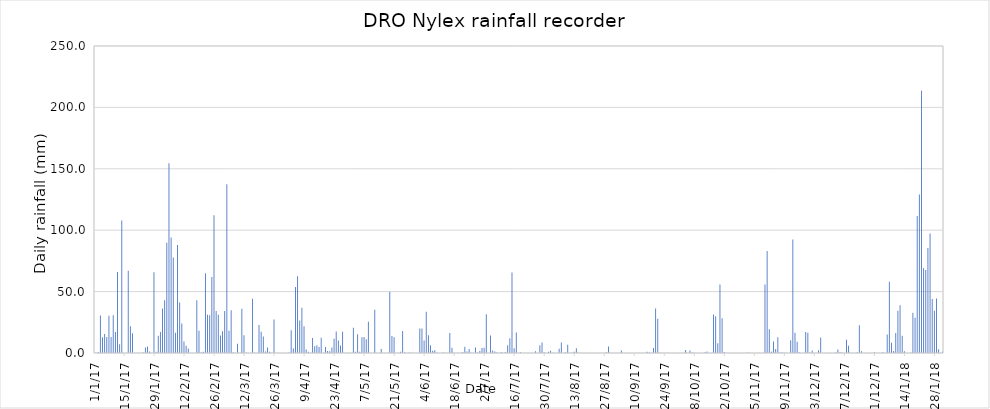
| Category | Series 0 |
|---|---|
| 2017-01-01 | 0 |
| 2017-01-02 | 0.8 |
| 2017-01-03 | 30.6 |
| 2017-01-04 | 12.8 |
| 2017-01-05 | 15.4 |
| 2017-01-06 | 13 |
| 2017-01-07 | 30.4 |
| 2017-01-08 | 13 |
| 2017-01-09 | 30.8 |
| 2017-01-10 | 17.1 |
| 2017-01-11 | 66 |
| 2017-01-12 | 7.1 |
| 2017-01-13 | 108 |
| 2017-01-14 | 0 |
| 2017-01-15 | 0 |
| 2017-01-16 | 67 |
| 2017-01-17 | 21.7 |
| 2017-01-18 | 16.1 |
| 2017-01-19 | 0 |
| 2017-01-20 | 0 |
| 2017-01-21 | 0 |
| 2017-01-22 | 0 |
| 2017-01-23 | 0.4 |
| 2017-01-24 | 4.5 |
| 2017-01-25 | 5.3 |
| 2017-01-26 | 1.2 |
| 2017-01-27 | 0.1 |
| 2017-01-28 | 65.7 |
| 2017-01-29 | 1.02 |
| 2017-01-30 | 14.1 |
| 2017-01-31 | 17 |
| 2017-02-01 | 36.3 |
| 2017-02-02 | 43 |
| 2017-02-03 | 89.7 |
| 2017-02-04 | 154.5 |
| 2017-02-05 | 94 |
| 2017-02-06 | 77.7 |
| 2017-02-07 | 16.5 |
| 2017-02-08 | 88 |
| 2017-02-09 | 41.2 |
| 2017-02-10 | 24 |
| 2017-02-11 | 9.3 |
| 2017-02-12 | 6 |
| 2017-02-13 | 3.7 |
| 2017-02-14 | 0 |
| 2017-02-15 | 0 |
| 2017-02-16 | 0 |
| 2017-02-17 | 43 |
| 2017-02-18 | 18.1 |
| 2017-02-19 | 0.5 |
| 2017-02-20 | 1.1 |
| 2017-02-21 | 65 |
| 2017-02-22 | 31.1 |
| 2017-02-23 | 30.7 |
| 2017-02-24 | 61.8 |
| 2017-02-25 | 112.1 |
| 2017-02-26 | 34.2 |
| 2017-02-27 | 31.2 |
| 2017-02-28 | 14.2 |
| 2017-03-01 | 17.8 |
| 2017-03-02 | 34.2 |
| 2017-03-03 | 137.5 |
| 2017-03-04 | 18.2 |
| 2017-03-05 | 34.8 |
| 2017-03-06 | 0.5 |
| 2017-03-07 | 0 |
| 2017-03-08 | 7.6 |
| 2017-03-09 | 0.1 |
| 2017-03-10 | 36 |
| 2017-03-11 | 14.5 |
| 2017-03-12 | 0.2 |
| 2017-03-13 | 0 |
| 2017-03-14 | 0 |
| 2017-03-15 | 44.1 |
| 2017-03-16 | 0.2 |
| 2017-03-17 | 0 |
| 2017-03-18 | 22.9 |
| 2017-03-19 | 17.3 |
| 2017-03-20 | 13.5 |
| 2017-03-21 | 1.3 |
| 2017-03-22 | 4.4 |
| 2017-03-23 | 1 |
| 2017-03-24 | 0 |
| 2017-03-25 | 27.3 |
| 2017-03-26 | 0.1 |
| 2017-03-27 | 0 |
| 2017-03-28 | 0 |
| 2017-03-29 | 0 |
| 2017-03-30 | 0 |
| 2017-03-31 | 0 |
| 2017-04-01 | 0.5 |
| 2017-04-02 | 18.5 |
| 2017-04-03 | 3.7 |
| 2017-04-04 | 53.7 |
| 2017-04-05 | 62.6 |
| 2017-04-06 | 26.5 |
| 2017-04-07 | 36.9 |
| 2017-04-08 | 21.7 |
| 2017-04-09 | 2.9 |
| 2017-04-10 | 1.1 |
| 2017-04-11 | 0 |
| 2017-04-12 | 12.2 |
| 2017-04-13 | 5.4 |
| 2017-04-14 | 6.4 |
| 2017-04-15 | 4.8 |
| 2017-04-16 | 12.4 |
| 2017-04-17 | 0 |
| 2017-04-18 | 4.8 |
| 2017-04-19 | 1.6 |
| 2017-04-20 | 1.5 |
| 2017-04-21 | 4.4 |
| 2017-04-22 | 11.7 |
| 2017-04-23 | 17.6 |
| 2017-04-24 | 10.1 |
| 2017-04-25 | 6.1 |
| 2017-04-26 | 17.4 |
| 2017-04-27 | 0.1 |
| 2017-04-28 | 0 |
| 2017-04-29 | 0.2 |
| 2017-04-30 | 0 |
| 2017-05-01 | 20.5 |
| 2017-05-02 | 1 |
| 2017-05-03 | 15.2 |
| 2017-05-04 | 1.1 |
| 2017-05-05 | 12.9 |
| 2017-05-06 | 13 |
| 2017-05-07 | 11.2 |
| 2017-05-08 | 25.5 |
| 2017-05-09 | 0 |
| 2017-05-10 | 0 |
| 2017-05-11 | 35.2 |
| 2017-05-12 | 0 |
| 2017-05-13 | 0 |
| 2017-05-14 | 3.2 |
| 2017-05-15 | 0.1 |
| 2017-05-16 | 0 |
| 2017-05-17 | 0 |
| 2017-05-18 | 49.8 |
| 2017-05-19 | 13.9 |
| 2017-05-20 | 12.8 |
| 2017-05-21 | 0 |
| 2017-05-22 | 0 |
| 2017-05-23 | 1 |
| 2017-05-24 | 18 |
| 2017-05-25 | 0.6 |
| 2017-05-26 | 0 |
| 2017-05-27 | 0.2 |
| 2017-05-28 | 0.2 |
| 2017-05-29 | 0 |
| 2017-05-30 | 0 |
| 2017-05-31 | 0 |
| 2017-06-01 | 20 |
| 2017-06-02 | 19.9 |
| 2017-06-03 | 10.2 |
| 2017-06-04 | 33.5 |
| 2017-06-05 | 14.5 |
| 2017-06-06 | 6.3 |
| 2017-06-07 | 1.9 |
| 2017-06-08 | 2.3 |
| 2017-06-09 | 0.3 |
| 2017-06-10 | 0 |
| 2017-06-11 | 0 |
| 2017-06-12 | 0.5 |
| 2017-06-13 | 0 |
| 2017-06-14 | 0 |
| 2017-06-15 | 16.2 |
| 2017-06-16 | 4.3 |
| 2017-06-17 | 0.2 |
| 2017-06-18 | 0 |
| 2017-06-19 | 0 |
| 2017-06-20 | 0 |
| 2017-06-21 | 0.8 |
| 2017-06-22 | 5 |
| 2017-06-23 | 1.3 |
| 2017-06-24 | 3.3 |
| 2017-06-25 | 0.2 |
| 2017-06-26 | 0 |
| 2017-06-27 | 4.5 |
| 2017-06-28 | 0.4 |
| 2017-06-29 | 1.6 |
| 2017-06-30 | 4 |
| 2017-07-01 | 4.3 |
| 2017-07-02 | 31.5 |
| 2017-07-03 | 0 |
| 2017-07-04 | 14.2 |
| 2017-07-05 | 2.1 |
| 2017-07-06 | 1.2 |
| 2017-07-07 | 0.5 |
| 2017-07-08 | 0 |
| 2017-07-09 | 0.8 |
| 2017-07-10 | 0 |
| 2017-07-11 | 0.8 |
| 2017-07-12 | 6.4 |
| 2017-07-13 | 12 |
| 2017-07-14 | 65.6 |
| 2017-07-15 | 3.8 |
| 2017-07-16 | 16.6 |
| 2017-07-17 | 0 |
| 2017-07-18 | 0.6 |
| 2017-07-19 | 0 |
| 2017-07-20 | 0 |
| 2017-07-21 | 0 |
| 2017-07-22 | 0 |
| 2017-07-23 | 0 |
| 2017-07-24 | 0 |
| 2017-07-25 | 1.5 |
| 2017-07-26 | 0 |
| 2017-07-27 | 6.3 |
| 2017-07-28 | 8.5 |
| 2017-07-29 | 0.7 |
| 2017-07-30 | 0.1 |
| 2017-07-31 | 1.1 |
| 2017-08-01 | 1.9 |
| 2017-08-02 | 0.2 |
| 2017-08-03 | 0 |
| 2017-08-04 | 0.1 |
| 2017-08-05 | 3.5 |
| 2017-08-06 | 8.5 |
| 2017-08-07 | 0.1 |
| 2017-08-08 | 0.4 |
| 2017-08-09 | 6.8 |
| 2017-08-10 | 0 |
| 2017-08-11 | 0.2 |
| 2017-08-12 | 1 |
| 2017-08-13 | 3.8 |
| 2017-08-14 | 0.2 |
| 2017-08-15 | 0 |
| 2017-08-16 | 0 |
| 2017-08-17 | 0 |
| 2017-08-18 | 0 |
| 2017-08-19 | 0 |
| 2017-08-20 | 0 |
| 2017-08-21 | 0 |
| 2017-08-22 | 0 |
| 2017-08-23 | 0 |
| 2017-08-24 | 0 |
| 2017-08-25 | 0 |
| 2017-08-26 | 0 |
| 2017-08-27 | 0.7 |
| 2017-08-28 | 5.2 |
| 2017-08-29 | 0.2 |
| 2017-08-30 | 0 |
| 2017-08-31 | 0.1 |
| 2017-09-01 | 0 |
| 2017-09-02 | 0 |
| 2017-09-03 | 2 |
| 2017-09-04 | 0 |
| 2017-09-05 | 0 |
| 2017-09-06 | 0 |
| 2017-09-07 | 0 |
| 2017-09-08 | 0 |
| 2017-09-09 | 0 |
| 2017-09-10 | 0 |
| 2017-09-11 | 0 |
| 2017-09-12 | 0 |
| 2017-09-13 | 0 |
| 2017-09-14 | 0 |
| 2017-09-15 | 1.1 |
| 2017-09-16 | 0.4 |
| 2017-09-17 | 0 |
| 2017-09-18 | 4 |
| 2017-09-19 | 36.3 |
| 2017-09-20 | 27.9 |
| 2017-09-21 | 0.2 |
| 2017-09-22 | 0 |
| 2017-09-23 | 0 |
| 2017-09-24 | 0 |
| 2017-09-25 | 0 |
| 2017-09-26 | 0 |
| 2017-09-27 | 0 |
| 2017-09-28 | 0 |
| 2017-09-29 | 0 |
| 2017-09-30 | 0 |
| 2017-10-01 | 0 |
| 2017-10-02 | 0 |
| 2017-10-03 | 2.5 |
| 2017-10-04 | 0 |
| 2017-10-05 | 2 |
| 2017-10-06 | 0.5 |
| 2017-10-07 | 0.2 |
| 2017-10-08 | 0 |
| 2017-10-09 | 0 |
| 2017-10-10 | 0 |
| 2017-10-11 | 0 |
| 2017-10-12 | 0.6 |
| 2017-10-13 | 1.2 |
| 2017-10-14 | 0 |
| 2017-10-15 | 0 |
| 2017-10-16 | 31.4 |
| 2017-10-17 | 30 |
| 2017-10-18 | 8 |
| 2017-10-19 | 55.7 |
| 2017-10-20 | 28.2 |
| 2017-10-21 | 0.89 |
| 2017-10-22 | 0 |
| 2017-10-23 | 0 |
| 2017-10-24 | 0.1 |
| 2017-10-25 | 0 |
| 2017-10-26 | 0 |
| 2017-10-27 | 0 |
| 2017-10-28 | 0 |
| 2017-10-29 | 0 |
| 2017-10-30 | 0 |
| 2017-10-31 | 0 |
| 2017-11-01 | 0.4 |
| 2017-11-02 | 0 |
| 2017-11-03 | 0 |
| 2017-11-04 | 0 |
| 2017-11-05 | 0 |
| 2017-11-06 | 0 |
| 2017-11-07 | 0 |
| 2017-11-08 | 0 |
| 2017-11-09 | 55.8 |
| 2017-11-10 | 83 |
| 2017-11-11 | 19.3 |
| 2017-11-12 | 1 |
| 2017-11-13 | 9.3 |
| 2017-11-14 | 3.3 |
| 2017-11-15 | 12.9 |
| 2017-11-16 | 0.5 |
| 2017-11-17 | 0.5 |
| 2017-11-18 | 0.2 |
| 2017-11-19 | 0 |
| 2017-11-20 | 0 |
| 2017-11-21 | 10.3 |
| 2017-11-22 | 92.5 |
| 2017-11-23 | 16.5 |
| 2017-11-24 | 9.1 |
| 2017-11-25 | 0.6 |
| 2017-11-26 | 0 |
| 2017-11-27 | 0 |
| 2017-11-28 | 17 |
| 2017-11-29 | 16.5 |
| 2017-11-30 | 0.5 |
| 2017-12-01 | 2 |
| 2017-12-02 | 0 |
| 2017-12-03 | 0 |
| 2017-12-04 | 2.2 |
| 2017-12-05 | 12.7 |
| 2017-12-06 | 0 |
| 2017-12-07 | 0 |
| 2017-12-08 | 0 |
| 2017-12-09 | 0 |
| 2017-12-10 | 0 |
| 2017-12-11 | 0 |
| 2017-12-12 | 0.4 |
| 2017-12-13 | 2.9 |
| 2017-12-14 | 0.7 |
| 2017-12-15 | 0.4 |
| 2017-12-16 | 0 |
| 2017-12-17 | 10.8 |
| 2017-12-18 | 6 |
| 2017-12-19 | 0.3 |
| 2017-12-20 | 0 |
| 2017-12-21 | 0 |
| 2017-12-22 | 0.6 |
| 2017-12-23 | 22.5 |
| 2017-12-24 | 1.4 |
| 2017-12-25 | 0.1 |
| 2017-12-26 | 0 |
| 2017-12-27 | 0 |
| 2017-12-28 | 0 |
| 2017-12-29 | 0 |
| 2017-12-30 | 0.7 |
| 2017-12-31 | 0 |
| 2018-01-01 | 0 |
| 2018-01-02 | 0 |
| 2018-01-03 | 0.7 |
| 2018-01-04 | 0 |
| 2018-01-05 | 15.1 |
| 2018-01-06 | 58 |
| 2018-01-07 | 8.4 |
| 2018-01-08 | 1.6 |
| 2018-01-09 | 16.2 |
| 2018-01-10 | 34.4 |
| 2018-01-11 | 38.9 |
| 2018-01-12 | 14 |
| 2018-01-13 | 1.4 |
| 2018-01-14 | 0.1 |
| 2018-01-15 | 0 |
| 2018-01-16 | 0.2 |
| 2018-01-17 | 32.8 |
| 2018-01-18 | 28.7 |
| 2018-01-19 | 111.6 |
| 2018-01-20 | 129 |
| 2018-01-21 | 213.6 |
| 2018-01-22 | 69 |
| 2018-01-23 | 67.6 |
| 2018-01-24 | 85.6 |
| 2018-01-25 | 97.3 |
| 2018-01-26 | 44 |
| 2018-01-27 | 34.5 |
| 2018-01-28 | 44.4 |
| 2018-01-29 | 3.1 |
| 2018-01-30 | 0.1 |
| 2018-01-31 | 1.1 |